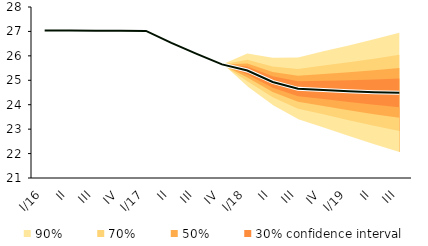
| Category | linka | Centerline |
|---|---|---|
| 0 | 27.039 | 27.039 |
| 1 | 27.039 | 27.039 |
| 2 | 27.028 | 27.028 |
| 3 | 27.028 | 27.028 |
| 4 | 27.02 | 27.02 |
| 5 | 26.532 | 26.532 |
| 6 | 26.084 | 26.084 |
| 7 | 25.651 | 25.651 |
| 8 | 25.4 | 25.4 |
| 9 | 24.932 | 24.932 |
| 10 | 24.651 | 24.651 |
| 11 | 24.607 | 24.607 |
| 12 | 24.554 | 24.554 |
| 13 | 24.512 | 24.512 |
| 14 | 24.485 | 24.485 |